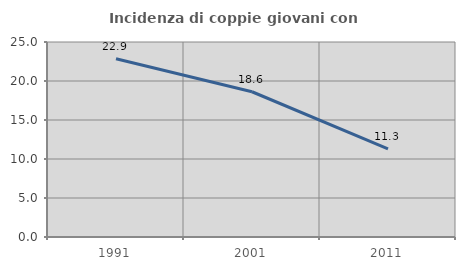
| Category | Incidenza di coppie giovani con figli |
|---|---|
| 1991.0 | 22.857 |
| 2001.0 | 18.622 |
| 2011.0 | 11.312 |